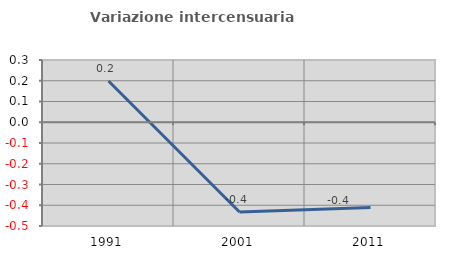
| Category | Variazione intercensuaria annua |
|---|---|
| 1991.0 | 0.199 |
| 2001.0 | -0.432 |
| 2011.0 | -0.411 |